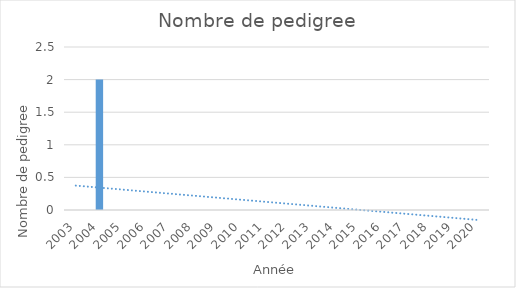
| Category | Series 0 |
|---|---|
| 2003.0 | 0 |
| 2004.0 | 2 |
| 2005.0 | 0 |
| 2006.0 | 0 |
| 2007.0 | 0 |
| 2008.0 | 0 |
| 2009.0 | 0 |
| 2010.0 | 0 |
| 2011.0 | 0 |
| 2012.0 | 0 |
| 2013.0 | 0 |
| 2014.0 | 0 |
| 2015.0 | 0 |
| 2016.0 | 0 |
| 2017.0 | 0 |
| 2018.0 | 0 |
| 2019.0 | 0 |
| 2020.0 | 0 |